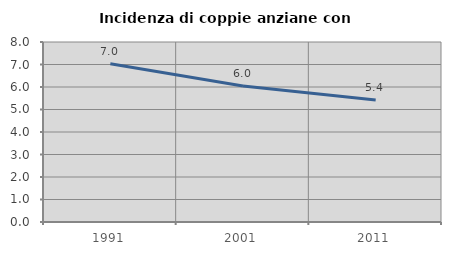
| Category | Incidenza di coppie anziane con figli |
|---|---|
| 1991.0 | 7.031 |
| 2001.0 | 6.04 |
| 2011.0 | 5.422 |